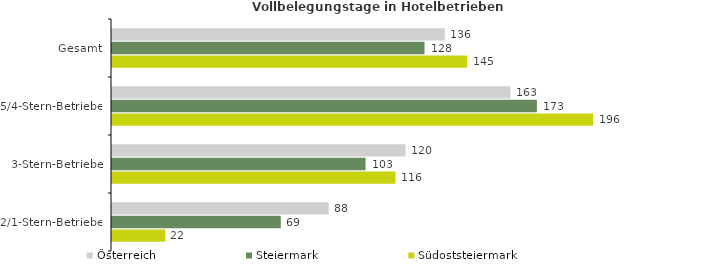
| Category | Österreich | Steiermark | Südoststeiermark |
|---|---|---|---|
| Gesamt | 135.866 | 127.561 | 144.953 |
| 5/4-Stern-Betriebe | 162.683 | 173.435 | 196.385 |
| 3-Stern-Betriebe | 119.851 | 103.499 | 115.707 |
| 2/1-Stern-Betriebe | 88.435 | 68.894 | 21.746 |